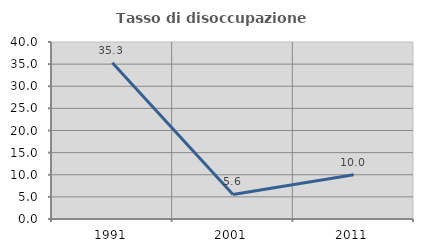
| Category | Tasso di disoccupazione giovanile  |
|---|---|
| 1991.0 | 35.294 |
| 2001.0 | 5.556 |
| 2011.0 | 10 |